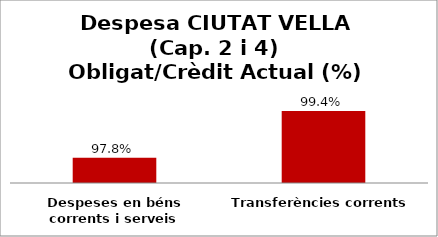
| Category | Series 0 |
|---|---|
| Despeses en béns corrents i serveis | 0.978 |
| Transferències corrents | 0.994 |